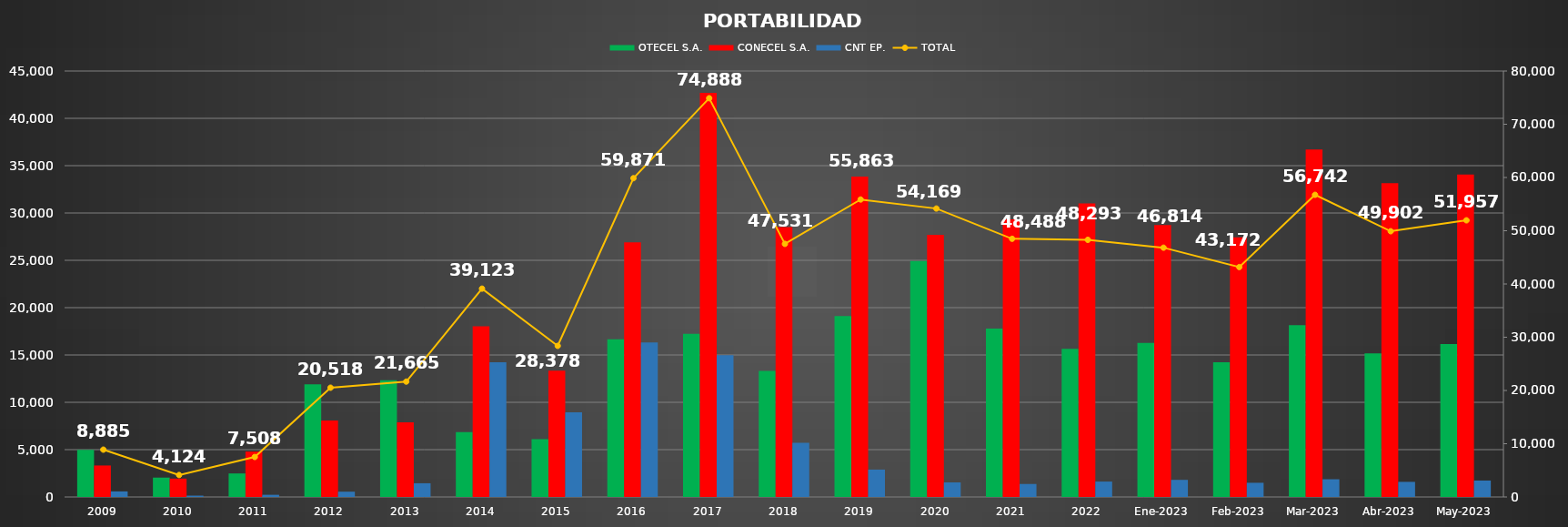
| Category | OTECEL S.A. | CONECEL S.A. | CNT EP. |
|---|---|---|---|
| 2009 | 4973 | 3324 | 588 |
| 2010 | 2045 | 1939 | 140 |
| 2011 | 2484 | 4796 | 228 |
| 2012 | 11894 | 8067 | 557 |
| 2013 | 12323 | 7893 | 1449 |
| 2014 | 6853 | 18039 | 14231 |
| 2015 | 6105 | 13334 | 8939 |
| 2016 | 16653 | 26907 | 16311 |
| 2017 | 17228 | 42694 | 14966 |
| 2018 | 13309 | 28504 | 5718 |
| 2019 | 19116 | 33857 | 2890 |
| 2020 | 24933 | 27700 | 1536 |
| 2021 | 17795 | 29321 | 1372 |
| 2022 | 15655 | 31012 | 1626 |
| Ene-2023 | 16278 | 28730 | 1806 |
| Feb-2023 | 14237 | 27438 | 1497 |
| Mar-2023 | 18159 | 36713 | 1870 |
| Abr-2023 | 15167 | 33140 | 1595 |
| May-2023 | 16147 | 34074 | 1736 |